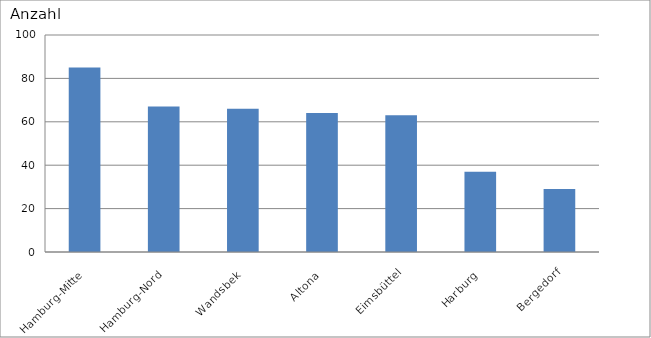
| Category | Hamburg-Mitte |
|---|---|
| Hamburg-Mitte | 85 |
| Hamburg-Nord | 67 |
| Wandsbek | 66 |
| Altona | 64 |
| Eimsbüttel | 63 |
| Harburg | 37 |
| Bergedorf | 29 |